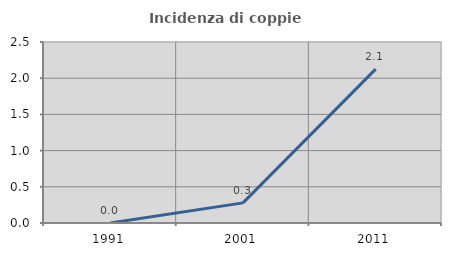
| Category | Incidenza di coppie miste |
|---|---|
| 1991.0 | 0 |
| 2001.0 | 0.278 |
| 2011.0 | 2.125 |